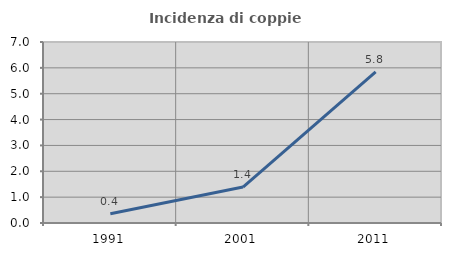
| Category | Incidenza di coppie miste |
|---|---|
| 1991.0 | 0.361 |
| 2001.0 | 1.389 |
| 2011.0 | 5.846 |